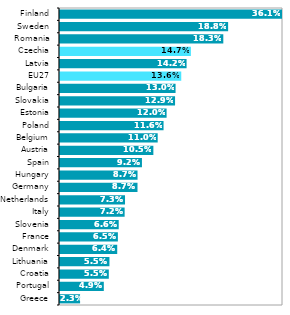
| Category | 2019* |
|---|---|
| Greece | 0.023 |
| Portugal | 0.049 |
| Croatia | 0.055 |
| Lithuania | 0.055 |
| Denmark | 0.064 |
| France | 0.065 |
| Slovenia | 0.066 |
| Italy | 0.072 |
| Netherlands | 0.073 |
| Germany | 0.087 |
| Hungary | 0.087 |
| Spain | 0.092 |
| Austria | 0.105 |
| Belgium | 0.11 |
| Poland | 0.116 |
| Estonia | 0.12 |
| Slovakia | 0.129 |
| Bulgaria | 0.13 |
| EU27 | 0.136 |
| Latvia | 0.142 |
| Czechia | 0.147 |
| Romania | 0.183 |
| Sweden | 0.188 |
| Finland | 0.361 |